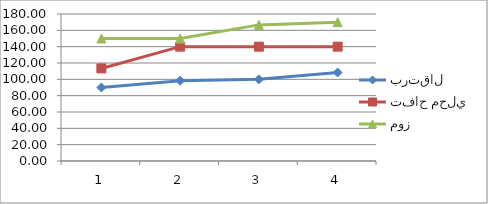
| Category | برتقال | تفاح محلي | موز |
|---|---|---|---|
| 0 | 90 | 113.33 | 150 |
| 1 | 98.33 | 140 | 150 |
| 2 | 100 | 140 | 166.67 |
| 3 | 108.33 | 140 | 170 |